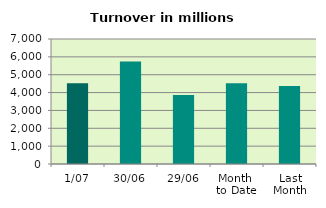
| Category | Series 0 |
|---|---|
| 1/07 | 4527.138 |
| 30/06 | 5737.081 |
| 29/06 | 3857.344 |
| Month 
to Date | 4527.138 |
| Last
Month | 4366.67 |